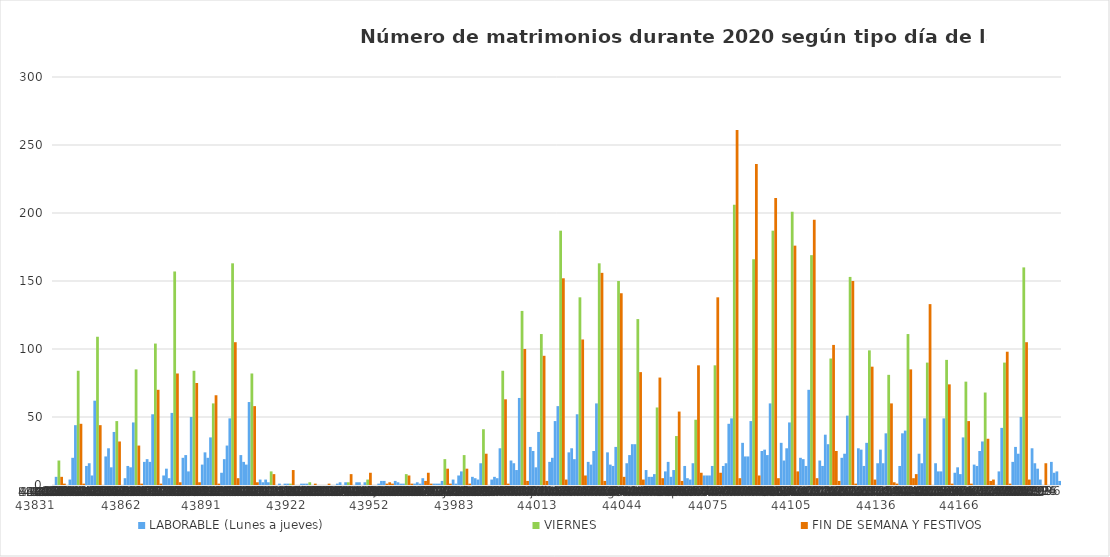
| Category | LABORABLE (Lunes a jueves) | VIERNES | FIN DE SEMANA Y FESTIVOS |
|---|---|---|---|
| 0 | 0 | 0 | 0 |
| 1 | 6 | 0 | 0 |
| 2 | 0 | 18 | 0 |
| 3 | 0 | 0 | 6 |
| 4 | 0 | 0 | 1 |
| 5 | 0 | 0 | 0 |
| 6 | 4 | 0 | 0 |
| 7 | 20 | 0 | 0 |
| 8 | 44 | 0 | 0 |
| 9 | 0 | 84 | 0 |
| 10 | 0 | 0 | 45 |
| 11 | 0 | 0 | 1 |
| 12 | 14 | 0 | 0 |
| 13 | 16 | 0 | 0 |
| 14 | 7 | 0 | 0 |
| 15 | 62 | 0 | 0 |
| 16 | 0 | 109 | 0 |
| 17 | 0 | 0 | 44 |
| 18 | 0 | 0 | 0 |
| 19 | 21 | 0 | 0 |
| 20 | 27 | 0 | 0 |
| 21 | 13 | 0 | 0 |
| 22 | 39 | 0 | 0 |
| 23 | 0 | 47 | 0 |
| 24 | 0 | 0 | 32 |
| 25 | 0 | 0 | 0 |
| 26 | 5 | 0 | 0 |
| 27 | 14 | 0 | 0 |
| 28 | 13 | 0 | 0 |
| 29 | 46 | 0 | 0 |
| 30 | 0 | 85 | 0 |
| 31 | 0 | 0 | 29 |
| 32 | 0 | 0 | 1 |
| 33 | 17 | 0 | 0 |
| 34 | 19 | 0 | 0 |
| 35 | 17 | 0 | 0 |
| 36 | 52 | 0 | 0 |
| 37 | 0 | 104 | 0 |
| 38 | 0 | 0 | 70 |
| 39 | 0 | 0 | 1 |
| 40 | 7 | 0 | 0 |
| 41 | 12 | 0 | 0 |
| 42 | 5 | 0 | 0 |
| 43 | 53 | 0 | 0 |
| 44 | 0 | 157 | 0 |
| 45 | 0 | 0 | 82 |
| 46 | 0 | 0 | 2 |
| 47 | 20 | 0 | 0 |
| 48 | 22 | 0 | 0 |
| 49 | 10 | 0 | 0 |
| 50 | 50 | 0 | 0 |
| 51 | 0 | 84 | 0 |
| 52 | 0 | 0 | 75 |
| 53 | 0 | 0 | 2 |
| 54 | 15 | 0 | 0 |
| 55 | 24 | 0 | 0 |
| 56 | 20 | 0 | 0 |
| 57 | 35 | 0 | 0 |
| 58 | 0 | 60 | 0 |
| 59 | 0 | 0 | 66 |
| 60 | 0 | 0 | 1 |
| 61 | 9 | 0 | 0 |
| 62 | 19 | 0 | 0 |
| 63 | 29 | 0 | 0 |
| 64 | 49 | 0 | 0 |
| 65 | 0 | 163 | 0 |
| 66 | 0 | 0 | 105 |
| 67 | 0 | 0 | 5 |
| 68 | 22 | 0 | 0 |
| 69 | 17 | 0 | 0 |
| 70 | 15 | 0 | 0 |
| 71 | 61 | 0 | 0 |
| 72 | 0 | 82 | 0 |
| 73 | 0 | 0 | 58 |
| 74 | 0 | 0 | 2 |
| 75 | 4 | 0 | 0 |
| 76 | 2 | 0 | 0 |
| 77 | 4 | 0 | 0 |
| 78 | 2 | 0 | 0 |
| 79 | 0 | 10 | 0 |
| 80 | 0 | 0 | 8 |
| 81 | 0 | 0 | 0 |
| 82 | 1 | 0 | 0 |
| 83 | 0 | 0 | 0 |
| 84 | 1 | 0 | 0 |
| 85 | 1 | 0 | 0 |
| 86 | 0 | 1 | 0 |
| 87 | 0 | 0 | 11 |
| 88 | 0 | 0 | 0 |
| 89 | 0 | 0 | 0 |
| 90 | 1 | 0 | 0 |
| 91 | 1 | 0 | 0 |
| 92 | 1 | 0 | 0 |
| 93 | 0 | 2 | 0 |
| 94 | 0 | 0 | 0 |
| 95 | 0 | 0 | 1 |
| 96 | 0 | 0 | 0 |
| 97 | 0 | 0 | 0 |
| 98 | 0 | 0 | 0 |
| 99 | 0 | 0 | 0 |
| 100 | 0 | 0 | 1 |
| 101 | 0 | 0 | 0 |
| 102 | 0 | 0 | 0 |
| 103 | 1 | 0 | 0 |
| 104 | 2 | 0 | 0 |
| 105 | 0 | 0 | 0 |
| 106 | 2 | 0 | 0 |
| 107 | 0 | 2 | 0 |
| 108 | 0 | 0 | 8 |
| 109 | 0 | 0 | 0 |
| 110 | 2 | 0 | 0 |
| 111 | 2 | 0 | 0 |
| 112 | 0 | 0 | 0 |
| 113 | 2 | 0 | 0 |
| 114 | 0 | 4 | 0 |
| 115 | 0 | 0 | 9 |
| 116 | 0 | 0 | 0 |
| 117 | 0 | 0 | 0 |
| 118 | 1 | 0 | 0 |
| 119 | 3 | 0 | 0 |
| 120 | 3 | 0 | 0 |
| 121 | 0 | 0 | 1 |
| 122 | 0 | 0 | 2 |
| 123 | 0 | 0 | 1 |
| 124 | 3 | 0 | 0 |
| 125 | 2 | 0 | 0 |
| 126 | 1 | 0 | 0 |
| 127 | 1 | 0 | 0 |
| 128 | 0 | 8 | 0 |
| 129 | 0 | 0 | 7 |
| 130 | 0 | 0 | 1 |
| 131 | 1 | 0 | 0 |
| 132 | 2 | 0 | 0 |
| 133 | 1 | 0 | 0 |
| 134 | 5 | 0 | 0 |
| 135 | 0 | 0 | 3 |
| 136 | 0 | 0 | 9 |
| 137 | 0 | 0 | 1 |
| 138 | 1 | 0 | 0 |
| 139 | 1 | 0 | 0 |
| 140 | 1 | 0 | 0 |
| 141 | 3 | 0 | 0 |
| 142 | 0 | 19 | 0 |
| 143 | 0 | 0 | 12 |
| 144 | 0 | 0 | 1 |
| 145 | 4 | 0 | 0 |
| 146 | 1 | 0 | 0 |
| 147 | 7 | 0 | 0 |
| 148 | 10 | 0 | 0 |
| 149 | 0 | 22 | 0 |
| 150 | 0 | 0 | 12 |
| 151 | 0 | 0 | 1 |
| 152 | 6 | 0 | 0 |
| 153 | 5 | 0 | 0 |
| 154 | 4 | 0 | 0 |
| 155 | 16 | 0 | 0 |
| 156 | 0 | 41 | 0 |
| 157 | 0 | 0 | 23 |
| 158 | 0 | 0 | 0 |
| 159 | 4 | 0 | 0 |
| 160 | 6 | 0 | 0 |
| 161 | 5 | 0 | 0 |
| 162 | 27 | 0 | 0 |
| 163 | 0 | 84 | 0 |
| 164 | 0 | 0 | 63 |
| 165 | 0 | 0 | 1 |
| 166 | 18 | 0 | 0 |
| 167 | 16 | 0 | 0 |
| 168 | 11 | 0 | 0 |
| 169 | 64 | 0 | 0 |
| 170 | 0 | 128 | 0 |
| 171 | 0 | 0 | 100 |
| 172 | 0 | 0 | 3 |
| 173 | 28 | 0 | 0 |
| 174 | 25 | 0 | 0 |
| 175 | 13 | 0 | 0 |
| 176 | 39 | 0 | 0 |
| 177 | 0 | 111 | 0 |
| 178 | 0 | 0 | 95 |
| 179 | 0 | 0 | 3 |
| 180 | 17 | 0 | 0 |
| 181 | 20 | 0 | 0 |
| 182 | 47 | 0 | 0 |
| 183 | 58 | 0 | 0 |
| 184 | 0 | 187 | 0 |
| 185 | 0 | 0 | 152 |
| 186 | 0 | 0 | 4 |
| 187 | 24 | 0 | 0 |
| 188 | 27 | 0 | 0 |
| 189 | 19 | 0 | 0 |
| 190 | 52 | 0 | 0 |
| 191 | 0 | 138 | 0 |
| 192 | 0 | 0 | 107 |
| 193 | 0 | 0 | 7 |
| 194 | 17 | 0 | 0 |
| 195 | 15 | 0 | 0 |
| 196 | 25 | 0 | 0 |
| 197 | 60 | 0 | 0 |
| 198 | 0 | 163 | 0 |
| 199 | 0 | 0 | 156 |
| 200 | 0 | 0 | 3 |
| 201 | 24 | 0 | 0 |
| 202 | 15 | 0 | 0 |
| 203 | 14 | 0 | 0 |
| 204 | 28 | 0 | 0 |
| 205 | 0 | 150 | 0 |
| 206 | 0 | 0 | 141 |
| 207 | 0 | 0 | 6 |
| 208 | 16 | 0 | 0 |
| 209 | 22 | 0 | 0 |
| 210 | 30 | 0 | 0 |
| 211 | 30 | 0 | 0 |
| 212 | 0 | 122 | 0 |
| 213 | 0 | 0 | 83 |
| 214 | 0 | 0 | 4 |
| 215 | 11 | 0 | 0 |
| 216 | 6 | 0 | 0 |
| 217 | 6 | 0 | 0 |
| 218 | 8 | 0 | 0 |
| 219 | 0 | 57 | 0 |
| 220 | 0 | 0 | 79 |
| 221 | 0 | 0 | 5 |
| 222 | 10 | 0 | 0 |
| 223 | 17 | 0 | 0 |
| 224 | 6 | 0 | 0 |
| 225 | 11 | 0 | 0 |
| 226 | 0 | 36 | 0 |
| 227 | 0 | 0 | 54 |
| 228 | 0 | 0 | 3 |
| 229 | 14 | 0 | 0 |
| 230 | 5 | 0 | 0 |
| 231 | 4 | 0 | 0 |
| 232 | 16 | 0 | 0 |
| 233 | 0 | 48 | 0 |
| 234 | 0 | 0 | 88 |
| 235 | 0 | 0 | 9 |
| 236 | 7 | 0 | 0 |
| 237 | 7 | 0 | 0 |
| 238 | 7 | 0 | 0 |
| 239 | 14 | 0 | 0 |
| 240 | 0 | 88 | 0 |
| 241 | 0 | 0 | 138 |
| 242 | 0 | 0 | 9 |
| 243 | 14 | 0 | 0 |
| 244 | 16 | 0 | 0 |
| 245 | 45 | 0 | 0 |
| 246 | 49 | 0 | 0 |
| 247 | 0 | 206 | 0 |
| 248 | 0 | 0 | 261 |
| 249 | 0 | 0 | 5 |
| 250 | 31 | 0 | 0 |
| 251 | 21 | 0 | 0 |
| 252 | 21 | 0 | 0 |
| 253 | 47 | 0 | 0 |
| 254 | 0 | 166 | 0 |
| 255 | 0 | 0 | 236 |
| 256 | 0 | 0 | 7 |
| 257 | 25 | 0 | 0 |
| 258 | 26 | 0 | 0 |
| 259 | 22 | 0 | 0 |
| 260 | 60 | 0 | 0 |
| 261 | 0 | 187 | 0 |
| 262 | 0 | 0 | 211 |
| 263 | 0 | 0 | 5 |
| 264 | 31 | 0 | 0 |
| 265 | 18 | 0 | 0 |
| 266 | 27 | 0 | 0 |
| 267 | 46 | 0 | 0 |
| 268 | 0 | 201 | 0 |
| 269 | 0 | 0 | 176 |
| 270 | 0 | 0 | 10 |
| 271 | 20 | 0 | 0 |
| 272 | 19 | 0 | 0 |
| 273 | 14 | 0 | 0 |
| 274 | 70 | 0 | 0 |
| 275 | 0 | 169 | 0 |
| 276 | 0 | 0 | 195 |
| 277 | 0 | 0 | 5 |
| 278 | 18 | 0 | 0 |
| 279 | 14 | 0 | 0 |
| 280 | 37 | 0 | 0 |
| 281 | 30 | 0 | 0 |
| 282 | 0 | 93 | 0 |
| 283 | 0 | 0 | 103 |
| 284 | 0 | 0 | 25 |
| 285 | 0 | 0 | 3 |
| 286 | 20 | 0 | 0 |
| 287 | 23 | 0 | 0 |
| 288 | 51 | 0 | 0 |
| 289 | 0 | 153 | 0 |
| 290 | 0 | 0 | 150 |
| 291 | 0 | 0 | 1 |
| 292 | 27 | 0 | 0 |
| 293 | 26 | 0 | 0 |
| 294 | 14 | 0 | 0 |
| 295 | 31 | 0 | 0 |
| 296 | 0 | 99 | 0 |
| 297 | 0 | 0 | 87 |
| 298 | 0 | 0 | 4 |
| 299 | 16 | 0 | 0 |
| 300 | 26 | 0 | 0 |
| 301 | 16 | 0 | 0 |
| 302 | 38 | 0 | 0 |
| 303 | 0 | 81 | 0 |
| 304 | 0 | 0 | 60 |
| 305 | 0 | 0 | 2 |
| 306 | 0 | 0 | 1 |
| 307 | 14 | 0 | 0 |
| 308 | 38 | 0 | 0 |
| 309 | 40 | 0 | 0 |
| 310 | 0 | 111 | 0 |
| 311 | 0 | 0 | 85 |
| 312 | 0 | 0 | 5 |
| 313 | 0 | 0 | 8 |
| 314 | 23 | 0 | 0 |
| 315 | 16 | 0 | 0 |
| 316 | 49 | 0 | 0 |
| 317 | 0 | 90 | 0 |
| 318 | 0 | 0 | 133 |
| 319 | 0 | 0 | 0 |
| 320 | 16 | 0 | 0 |
| 321 | 10 | 0 | 0 |
| 322 | 10 | 0 | 0 |
| 323 | 49 | 0 | 0 |
| 324 | 0 | 92 | 0 |
| 325 | 0 | 0 | 74 |
| 326 | 0 | 0 | 1 |
| 327 | 9 | 0 | 0 |
| 328 | 13 | 0 | 0 |
| 329 | 8 | 0 | 0 |
| 330 | 35 | 0 | 0 |
| 331 | 0 | 76 | 0 |
| 332 | 0 | 0 | 47 |
| 333 | 0 | 0 | 1 |
| 334 | 15 | 0 | 0 |
| 335 | 14 | 0 | 0 |
| 336 | 25 | 0 | 0 |
| 337 | 32 | 0 | 0 |
| 338 | 0 | 68 | 0 |
| 339 | 0 | 0 | 34 |
| 340 | 0 | 0 | 3 |
| 341 | 0 | 0 | 4 |
| 342 | 0 | 0 | 0 |
| 343 | 10 | 0 | 0 |
| 344 | 42 | 0 | 0 |
| 345 | 0 | 90 | 0 |
| 346 | 0 | 0 | 98 |
| 347 | 0 | 0 | 1 |
| 348 | 17 | 0 | 0 |
| 349 | 28 | 0 | 0 |
| 350 | 23 | 0 | 0 |
| 351 | 50 | 0 | 0 |
| 352 | 0 | 160 | 0 |
| 353 | 0 | 0 | 105 |
| 354 | 0 | 0 | 4 |
| 355 | 27 | 0 | 0 |
| 356 | 16 | 0 | 0 |
| 357 | 12 | 0 | 0 |
| 358 | 4 | 0 | 0 |
| 359 | 0 | 0 | 0 |
| 360 | 0 | 0 | 16 |
| 361 | 0 | 0 | 0 |
| 362 | 17 | 0 | 0 |
| 363 | 9 | 0 | 0 |
| 364 | 10 | 0 | 0 |
| 365 | 3 | 0 | 0 |